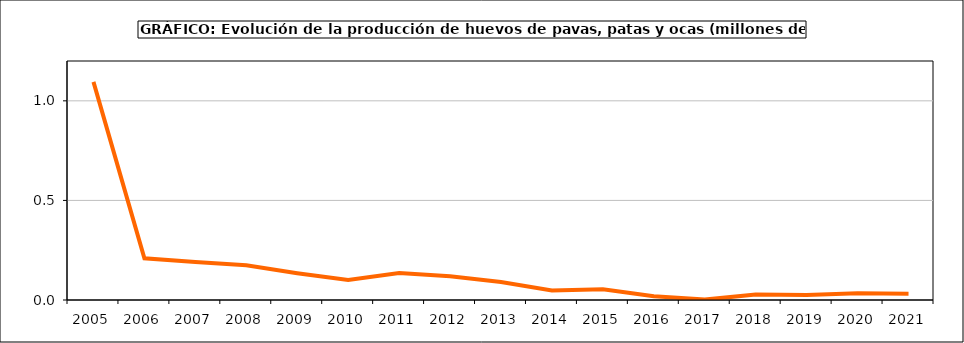
| Category | huevos |
|---|---|
| 2005.0 | 1.095 |
| 2006.0 | 0.209 |
| 2007.0 | 0.191 |
| 2008.0 | 0.174 |
| 2009.0 | 0.135 |
| 2010.0 | 0.1 |
| 2011.0 | 0.135 |
| 2012.0 | 0.119 |
| 2013.0 | 0.09 |
| 2014.0 | 0.047 |
| 2015.0 | 0.054 |
| 2016.0 | 0.019 |
| 2017.0 | 0.002 |
| 2018.0 | 0.027 |
| 2019.0 | 0.026 |
| 2020.0 | 0.034 |
| 2021.0 | 0.032 |